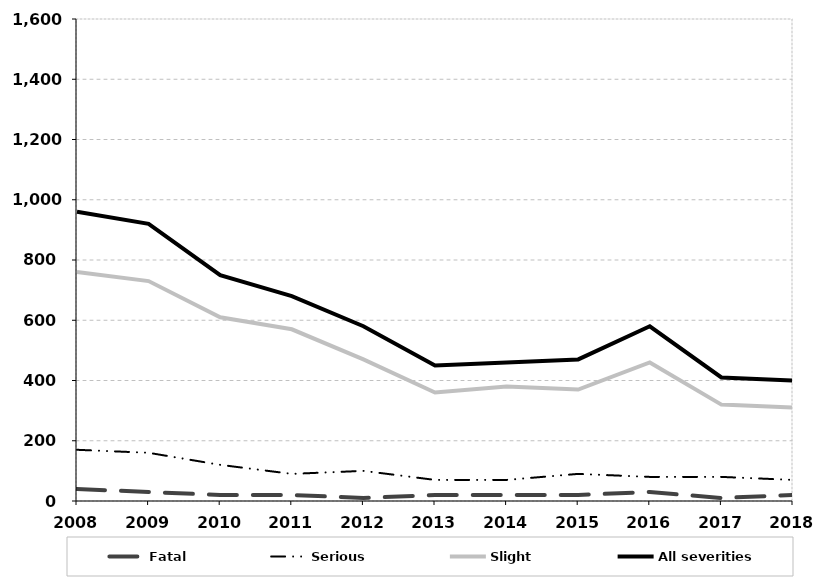
| Category | Fatal | Serious | Slight | All severities |
|---|---|---|---|---|
| 2008.0 | 40 | 170 | 760 | 960 |
| 2009.0 | 30 | 160 | 730 | 920 |
| 2010.0 | 20 | 120 | 610 | 750 |
| 2011.0 | 20 | 90 | 570 | 680 |
| 2012.0 | 10 | 100 | 470 | 580 |
| 2013.0 | 20 | 70 | 360 | 450 |
| 2014.0 | 20 | 70 | 380 | 460 |
| 2015.0 | 20 | 90 | 370 | 470 |
| 2016.0 | 30 | 80 | 460 | 580 |
| 2017.0 | 10 | 80 | 320 | 410 |
| 2018.0 | 20 | 70 | 310 | 400 |